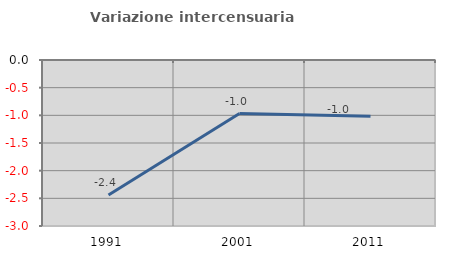
| Category | Variazione intercensuaria annua |
|---|---|
| 1991.0 | -2.439 |
| 2001.0 | -0.967 |
| 2011.0 | -1.014 |